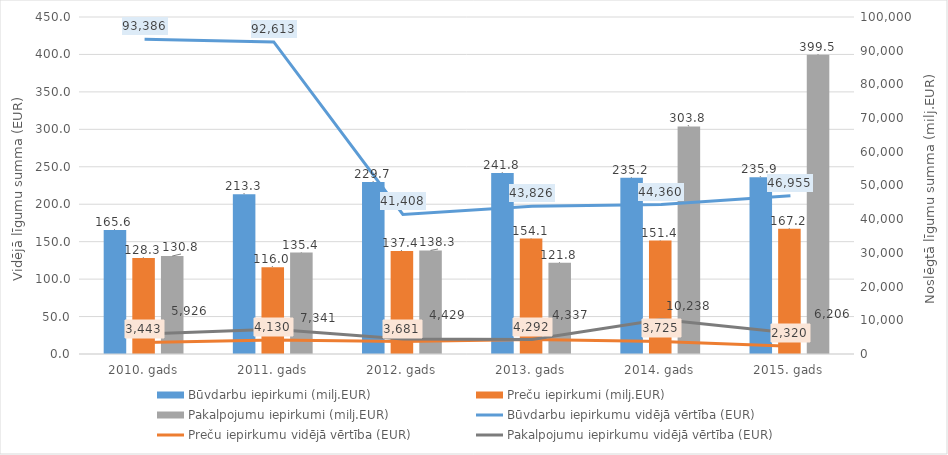
| Category | Būvdarbu iepirkumi (milj.EUR) | Preču iepirkumi (milj.EUR) | Pakalpojumu iepirkumi (milj.EUR) |
|---|---|---|---|
| 2010. gads | 165.6 | 128.3 | 130.8 |
| 2011. gads | 213.3 | 116 | 135.4 |
| 2012. gads | 229.7 | 137.4 | 138.3 |
| 2013. gads | 241.8 | 154.1 | 121.8 |
| 2014. gads | 235.2 | 151.4 | 303.8 |
| 2015. gads | 235.9 | 167.2 | 399.5 |